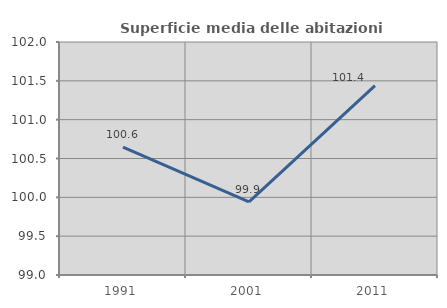
| Category | Superficie media delle abitazioni occupate |
|---|---|
| 1991.0 | 100.647 |
| 2001.0 | 99.94 |
| 2011.0 | 101.438 |